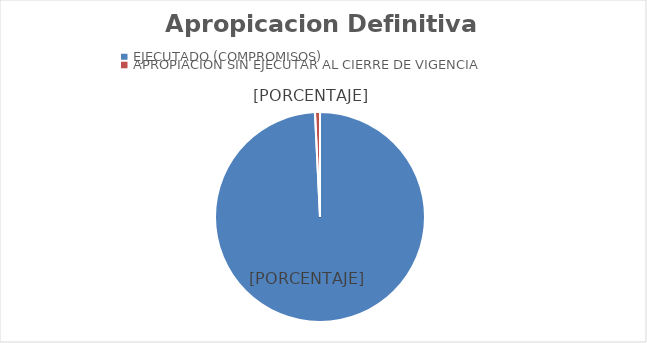
| Category | Series 0 |
|---|---|
| EJECUTADO (COMPROMISOS) | 629142621497.19 |
| APROPIACION SIN EJECUTAR AL CIERRE DE VIGENCIA | 4859867174.07 |